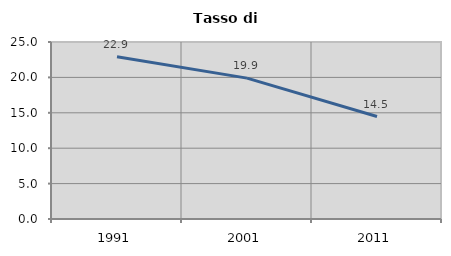
| Category | Tasso di disoccupazione   |
|---|---|
| 1991.0 | 22.923 |
| 2001.0 | 19.899 |
| 2011.0 | 14.471 |